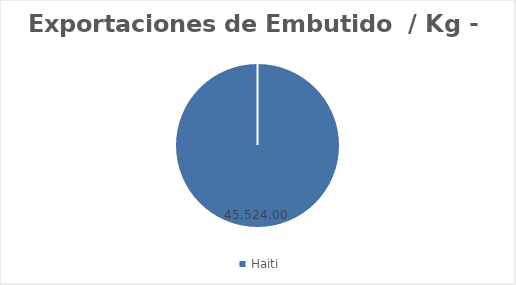
| Category | kg |
|---|---|
| Haiti | 45524 |